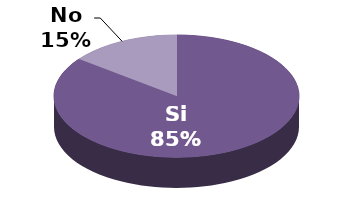
| Category | Series 1 |
|---|---|
| Si | 140 |
| No | 24 |